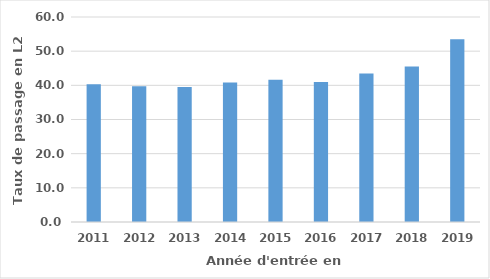
| Category | Taux de passage en L2 (%) |
|---|---|
| 2011.0 | 40.3 |
| 2012.0 | 39.7 |
| 2013.0 | 39.5 |
| 2014.0 | 40.8 |
| 2015.0 | 41.6 |
| 2016.0 | 41 |
| 2017.0 | 43.5 |
| 2018.0 | 45.5 |
| 2019.0 | 53.5 |